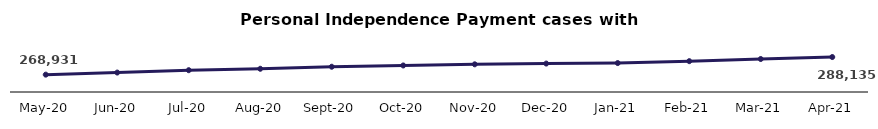
| Category | Series 0 |
|---|---|
| 2020-05-01 | 268931 |
| 2020-06-01 | 271212 |
| 2020-07-01 | 273785 |
| 2020-08-01 | 275335 |
| 2020-09-01 | 277557 |
| 2020-10-01 | 278937 |
| 2020-11-01 | 280211 |
| 2020-12-01 | 281031 |
| 2021-01-01 | 281564 |
| 2021-02-01 | 283635 |
| 2021-03-01 | 285989 |
| 2021-04-01 | 288135 |